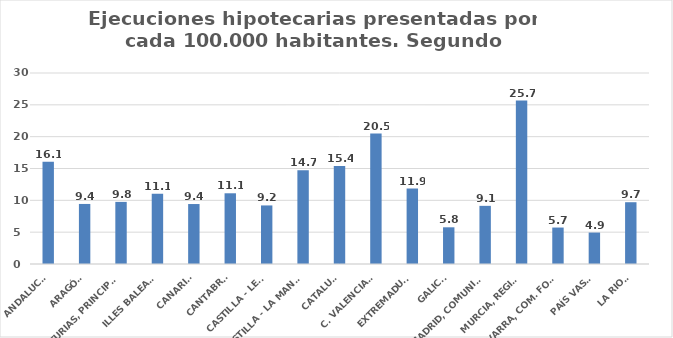
| Category | Series 0 |
|---|---|
| ANDALUCÍA | 16.07 |
| ARAGÓN | 9.432 |
| ASTURIAS, PRINCIPADO | 9.756 |
| ILLES BALEARS | 11.052 |
| CANARIAS | 9.419 |
| CANTABRIA | 11.107 |
| CASTILLA - LEÓN | 9.198 |
| CASTILLA - LA MANCHA | 14.716 |
| CATALUÑA | 15.379 |
| C. VALENCIANA | 20.488 |
| EXTREMADURA | 11.857 |
| GALICIA | 5.764 |
| MADRID, COMUNIDAD | 9.133 |
| MURCIA, REGIÓN | 25.662 |
| NAVARRA, COM. FORAL | 5.726 |
| PAÍS VASCO | 4.938 |
| LA RIOJA | 9.703 |